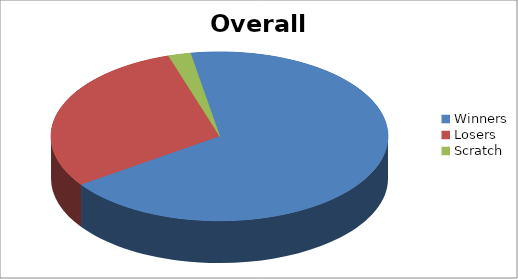
| Category | Series 1 |
|---|---|
| Winners | 32 |
| Losers | 14 |
| Scratch | 1 |